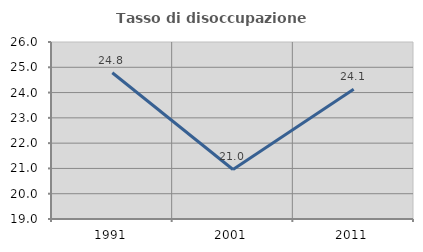
| Category | Tasso di disoccupazione giovanile  |
|---|---|
| 1991.0 | 24.786 |
| 2001.0 | 20.959 |
| 2011.0 | 24.131 |